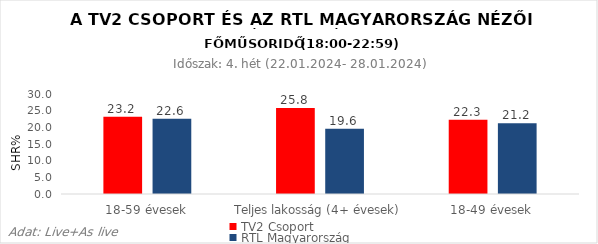
| Category | TV2 Csoport | RTL Magyarország |
|---|---|---|
| 18-59 évesek | 23.2 | 22.6 |
| Teljes lakosság (4+ évesek) | 25.8 | 19.6 |
| 18-49 évesek | 22.3 | 21.2 |